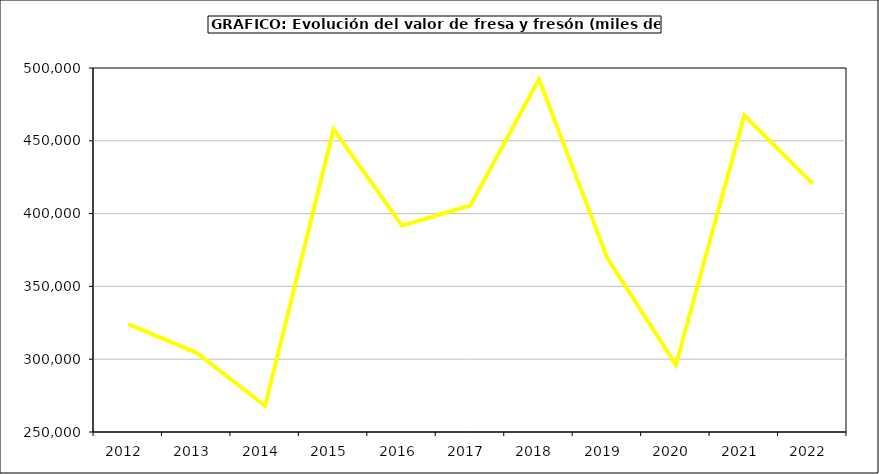
| Category | Valor |
|---|---|
| 2012.0 | 324144.524 |
| 2013.0 | 304404.377 |
| 2014.0 | 267944.247 |
| 2015.0 | 457982 |
| 2016.0 | 391643 |
| 2017.0 | 405540.083 |
| 2018.0 | 492270.548 |
| 2019.0 | 369382.02 |
| 2020.0 | 296066.25 |
| 2021.0 | 467473.002 |
| 2022.0 | 420610.735 |